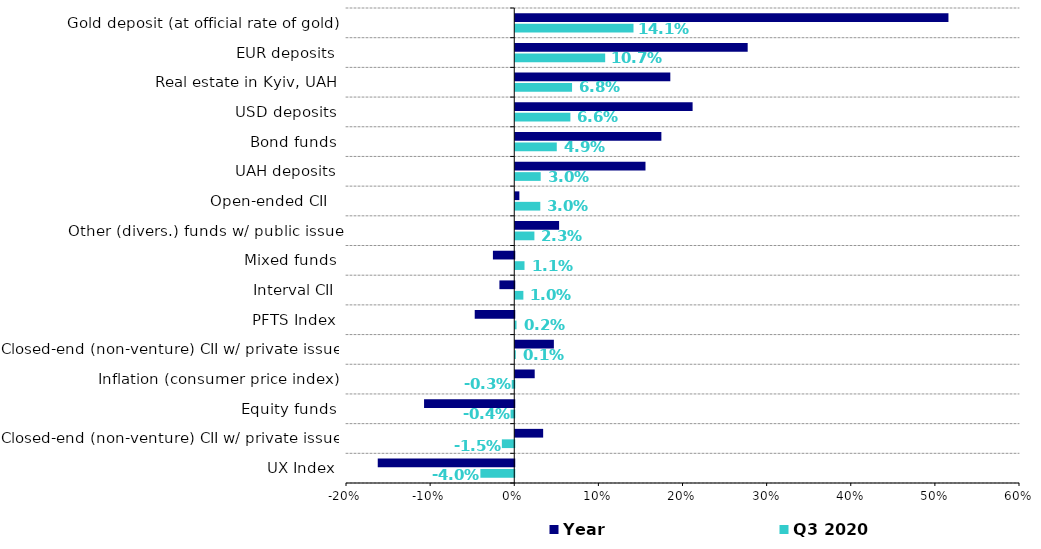
| Category | Q3 2020 | Year |
|---|---|---|
| UX Index | -0.04 | -0.162 |
| Closed-end (non-venture) CII w/ private issue | -0.015 | 0.033 |
| Equity funds | -0.004 | -0.107 |
| Inflation (consumer price index) | -0.003 | 0.023 |
| Closed-end (non-venture) CII w/ private issue | 0.001 | 0.046 |
| PFTS Index | 0.002 | -0.047 |
| Interval CII | 0.01 | -0.018 |
| Mixed funds | 0.011 | -0.025 |
| Other (divers.) funds w/ public issue | 0.023 | 0.052 |
| Open-ended CII   | 0.03 | 0.005 |
| UAH deposits | 0.03 | 0.155 |
| Bond funds | 0.049 | 0.174 |
| USD deposits | 0.066 | 0.211 |
| Real estate in Kyiv, UAH | 0.068 | 0.184 |
| EUR deposits | 0.107 | 0.276 |
| Gold deposit (at official rate of gold) | 0.141 | 0.515 |